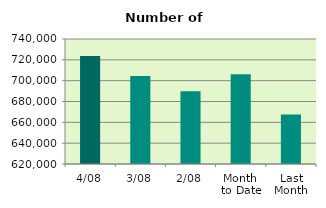
| Category | Series 0 |
|---|---|
| 4/08 | 723608 |
| 3/08 | 704598 |
| 2/08 | 689924 |
| Month 
to Date | 706043.333 |
| Last
Month | 667427.091 |